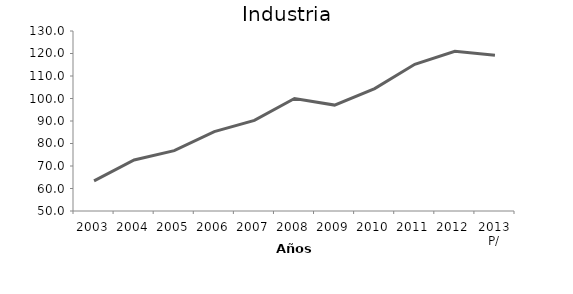
| Category | Industria |
|---|---|
| 2003 | 63.381 |
| 2004 | 72.653 |
| 2005 | 76.806 |
| 2006 | 85.283 |
| 2007 | 90.264 |
| 2008 | 100 |
| 2009 | 97.071 |
| 2010 | 104.414 |
| 2011 | 115.211 |
| 2012 | 120.947 |
| 2013 P/ | 119.259 |